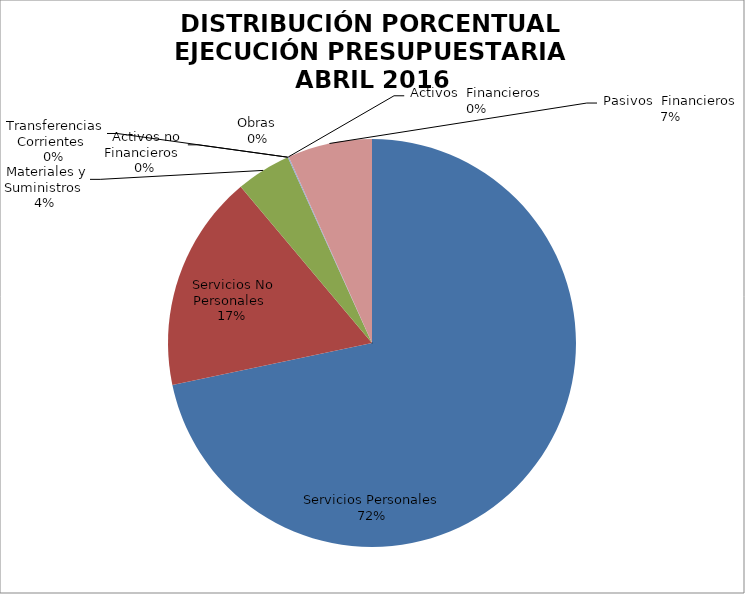
| Category | Series 0 | Series 1 |
|---|---|---|
| Servicios Personales | 11159618.67 | 0.828 |
| Servicios No Personales | 2674212.79 | 0.198 |
| Materiales y Suministros | 677416.15 | 0.05 |
| Transferencias Corrientes | 0 | 0 |
| Activos no Financieros | 0 | 0 |
| Obras | 0 | 0 |
| Activos  Financieros | 13200 | 0.001 |
| Pasivos  Financieros | -1041397.74 | -0.077 |